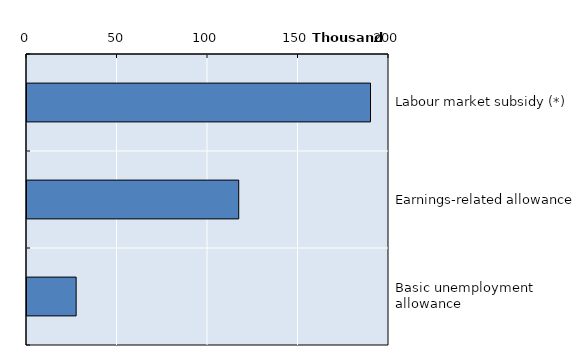
| Category | Series 0 |
|---|---|
| Labour market subsidy (*) | 189780 |
| Earnings-related allowance | 116972 |
| Basic unemployment allowance | 27157 |